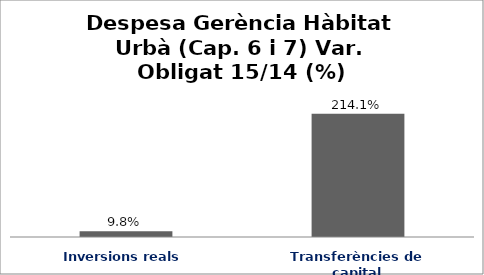
| Category | Series 0 |
|---|---|
| Inversions reals | 0.098 |
| Transferències de capital | 2.141 |